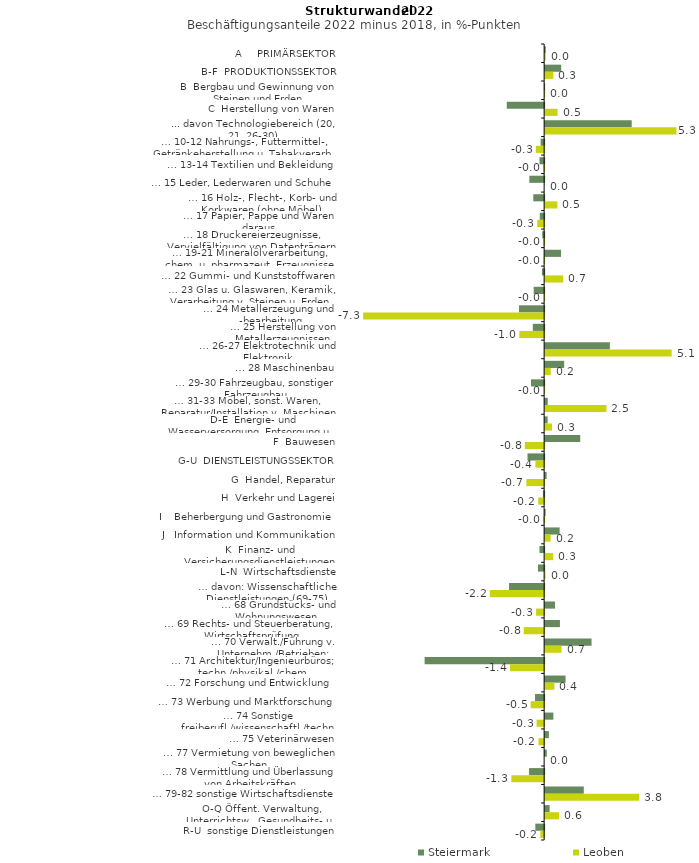
| Category | Steiermark | Leoben |
|---|---|---|
| A     PRIMÄRSEKTOR | 0.025 | 0.024 |
| B-F  PRODUKTIONSSEKTOR | 0.65 | 0.335 |
| B  Bergbau und Gewinnung von Steinen und Erden | -0.011 | 0.004 |
| C  Herstellung von Waren | -1.516 | 0.505 |
| ... davon Technologiebereich (20, 21, 26-30) | 3.513 | 5.329 |
| … 10-12 Nahrungs-, Futtermittel-, Getränkeherstellung u. Tabakverarb. | -0.143 | -0.338 |
| … 13-14 Textilien und Bekleidung | -0.189 | -0.037 |
| … 15 Leder, Lederwaren und Schuhe | -0.6 | 0 |
| … 16 Holz-, Flecht-, Korb- und Korkwaren (ohne Möbel)  | -0.44 | 0.497 |
| … 17 Papier, Pappe und Waren daraus  | -0.178 | -0.279 |
| … 18 Druckereierzeugnisse, Vervielfältigung von Datenträgern | -0.077 | -0.032 |
| … 19-21 Mineralölverarbeitung, chem. u. pharmazeut. Erzeugnisse | 0.646 | -0.021 |
| … 22 Gummi- und Kunststoffwaren | -0.089 | 0.734 |
| … 23 Glas u. Glaswaren, Keramik, Verarbeitung v. Steinen u. Erden  | -0.424 | -0.008 |
| … 24 Metallerzeugung und -bearbeitung | -1.019 | -7.344 |
| … 25 Herstellung von Metallerzeugnissen  | -0.459 | -1.007 |
| … 26-27 Elektrotechnik und Elektronik | 2.628 | 5.134 |
| … 28 Maschinenbau | 0.773 | 0.227 |
| … 29-30 Fahrzeugbau, sonstiger Fahrzeugbau | -0.534 | -0.012 |
| … 31-33 Möbel, sonst. Waren, Reparatur/Installation v. Maschinen | 0.106 | 2.489 |
| D-E  Energie- und Wasserversorgung, Entsorgung u. Rückgewinnung | 0.102 | 0.278 |
| F  Bauwesen | 1.424 | -0.787 |
| G-U  DIENSTLEISTUNGSSEKTOR | -0.676 | -0.355 |
| G  Handel, Reparatur | 0.059 | -0.722 |
| H  Verkehr und Lagerei | -0.05 | -0.239 |
| I    Beherbergung und Gastronomie | 0.02 | -0.036 |
| J   Information und Kommunikation | 0.588 | 0.223 |
| K  Finanz- und Versicherungsdienstleistungen | -0.188 | 0.328 |
| L-N  Wirtschaftsdienste | -0.252 | 0.016 |
| … davon: Wissenschaftliche Dienstleistungen (69-75) | -1.425 | -2.206 |
| … 68 Grundstücks- und Wohnungswesen  | 0.402 | -0.328 |
| … 69 Rechts- und Steuerberatung, Wirtschaftsprüfung | 0.6 | -0.827 |
| … 70 Verwalt./Führung v. Unternehm./Betrieben; Unternehmensberat. | 1.883 | 0.668 |
| … 71 Architektur/Ingenieurbüros; techn./physikal./chem. Untersuchung | -4.85 | -1.385 |
| … 72 Forschung und Entwicklung  | 0.828 | 0.376 |
| … 73 Werbung und Marktforschung | -0.372 | -0.547 |
| … 74 Sonstige freiberufl./wissenschaftl./techn. Tätigkeiten | 0.334 | -0.305 |
| … 75 Veterinärwesen | 0.152 | -0.23 |
| … 77 Vermietung von beweglichen Sachen  | 0.067 | 0 |
| … 78 Vermittlung und Überlassung von Arbeitskräften | -0.611 | -1.33 |
| … 79-82 sonstige Wirtschaftsdienste | 1.569 | 3.82 |
| O-Q Öffent. Verwaltung, Unterrichtsw., Gesundheits- u. Sozialwesen | 0.182 | 0.567 |
| R-U  sonstige Dienstleistungen | -0.359 | -0.151 |